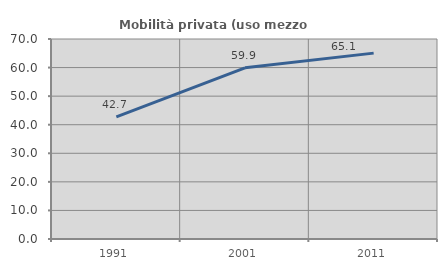
| Category | Mobilità privata (uso mezzo privato) |
|---|---|
| 1991.0 | 42.747 |
| 2001.0 | 59.917 |
| 2011.0 | 65.058 |